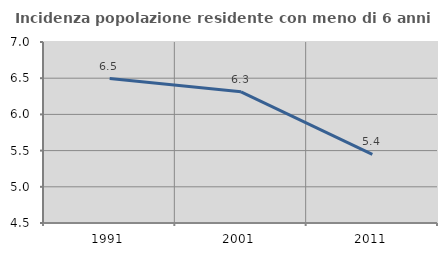
| Category | Incidenza popolazione residente con meno di 6 anni |
|---|---|
| 1991.0 | 6.495 |
| 2001.0 | 6.312 |
| 2011.0 | 5.449 |